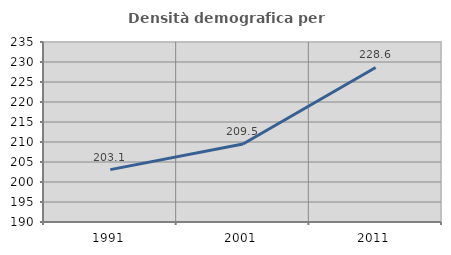
| Category | Densità demografica |
|---|---|
| 1991.0 | 203.095 |
| 2001.0 | 209.502 |
| 2011.0 | 228.638 |